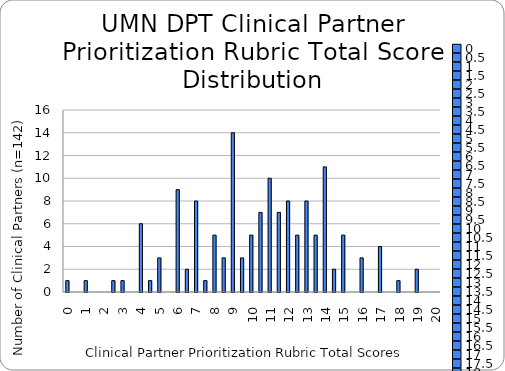
| Category | Series 0 |
|---|---|
| 0.0 | 1 |
| 0.5 | 0 |
| 1.0 | 1 |
| 1.5 | 0 |
| 2.0 | 0 |
| 2.5 | 1 |
| 3.0 | 1 |
| 3.5 | 0 |
| 4.0 | 6 |
| 4.5 | 1 |
| 5.0 | 3 |
| 5.5 | 0 |
| 6.0 | 9 |
| 6.5 | 2 |
| 7.0 | 8 |
| 7.5 | 1 |
| 8.0 | 5 |
| 8.5 | 3 |
| 9.0 | 14 |
| 9.5 | 3 |
| 10.0 | 5 |
| 10.5 | 7 |
| 11.0 | 10 |
| 11.5 | 7 |
| 12.0 | 8 |
| 12.5 | 5 |
| 13.0 | 8 |
| 13.5 | 5 |
| 14.0 | 11 |
| 14.5 | 2 |
| 15.0 | 5 |
| 15.5 | 0 |
| 16.0 | 3 |
| 16.5 | 0 |
| 17.0 | 4 |
| 17.5 | 0 |
| 18.0 | 1 |
| 18.5 | 0 |
| 19.0 | 2 |
| 19.5 | 0 |
| 20.0 | 0 |